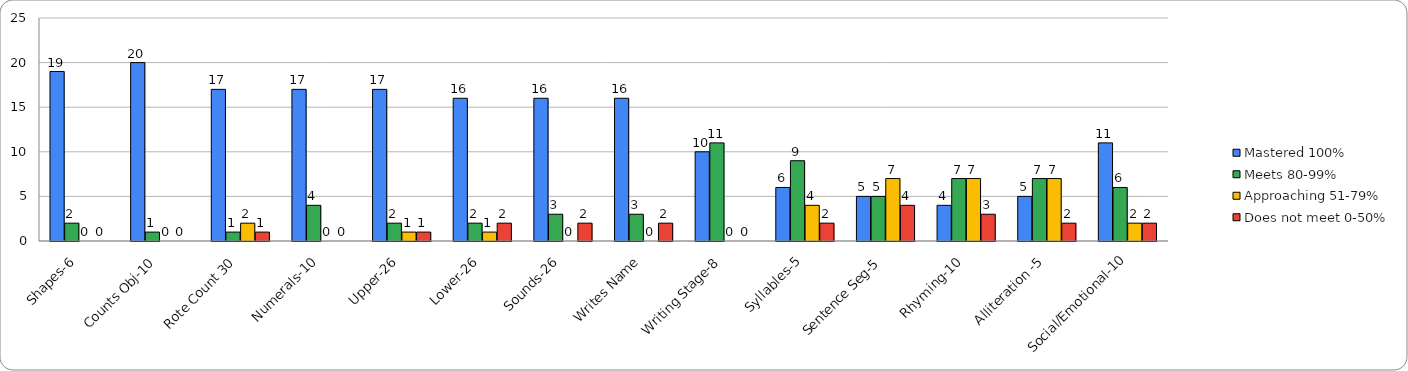
| Category | Mastered 100% | Meets 80-99% | Approaching 51-79% | Does not meet 0-50% |
|---|---|---|---|---|
| Shapes-6 | 19 | 2 | 0 | 0 |
| Counts Obj-10 | 20 | 1 | 0 | 0 |
| Rote Count 30 | 17 | 1 | 2 | 1 |
| Numerals-10 | 17 | 4 | 0 | 0 |
| Upper-26 | 17 | 2 | 1 | 1 |
| Lower-26 | 16 | 2 | 1 | 2 |
| Sounds-26 | 16 | 3 | 0 | 2 |
| Writes Name | 16 | 3 | 0 | 2 |
| Writing Stage-8 | 10 | 11 | 0 | 0 |
| Syllables-5 | 6 | 9 | 4 | 2 |
| Sentence Seg-5 | 5 | 5 | 7 | 4 |
| Rhyming-10 | 4 | 7 | 7 | 3 |
| Alliteration -5 | 5 | 7 | 7 | 2 |
| Social/Emotional-10 | 11 | 6 | 2 | 2 |